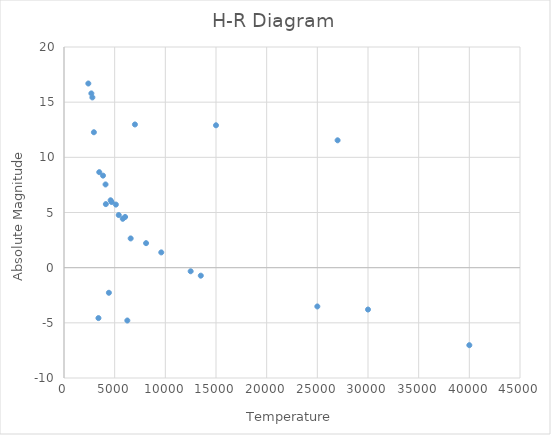
| Category | Series 0 |
|---|---|
| 8100.0 | 2.222 |
| 6030.0 | 4.596 |
| 3480.0 | 8.656 |
| 5120.0 | 5.718 |
| 2700.0 | 15.793 |
| 4600.0 | 6.107 |
| 6250.0 | -4.79 |
| 4700.0 | 5.949 |
| 9600.0 | 1.383 |
| 27000.0 | 11.543 |
| 6580.0 | 2.65 |
| 7000.0 | 12.98 |
| 2950.0 | 12.273 |
| 4430.0 | -2.275 |
| 15000.0 | 12.905 |
| 2400.0 | 16.691 |
| 2800.0 | 15.43 |
| 5800.0 | 4.43 |
| 4130.0 | 5.76 |
| 5400.0 | 4.771 |
| 4100.0 | 7.543 |
| 3850.0 | 8.343 |
| 12500.0 | -0.326 |
| 3400.0 | -4.57 |
| 13500.0 | -0.725 |
| 25000.0 | -3.515 |
| 30000.0 | -3.794 |
| 40000.0 | -7.025 |